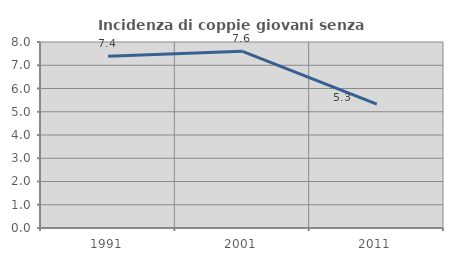
| Category | Incidenza di coppie giovani senza figli |
|---|---|
| 1991.0 | 7.387 |
| 2001.0 | 7.598 |
| 2011.0 | 5.326 |